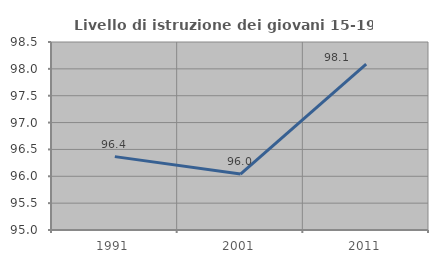
| Category | Livello di istruzione dei giovani 15-19 anni |
|---|---|
| 1991.0 | 96.366 |
| 2001.0 | 96.041 |
| 2011.0 | 98.088 |